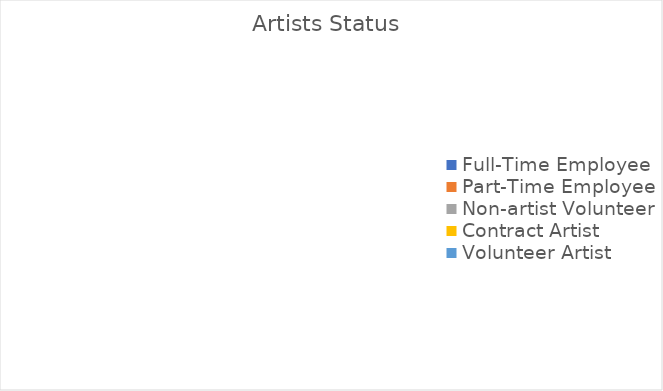
| Category | Series 0 |
|---|---|
| Full-Time Employee | 0 |
| Part-Time Employee | 0 |
| Non-artist Volunteer | 0 |
| Contract Artist | 0 |
| Volunteer Artist | 0 |